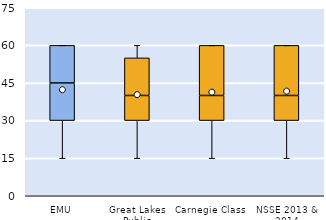
| Category | 25th | 50th | 75th |
|---|---|---|---|
| EMU | 30 | 15 | 15 |
| Great Lakes Public | 30 | 10 | 15 |
| Carnegie Class | 30 | 10 | 20 |
| NSSE 2013 & 2014 | 30 | 10 | 20 |